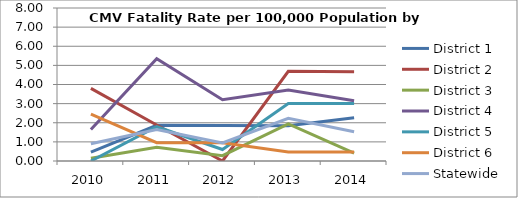
| Category | District 1 | District 2 | District 3 | District 4 | District 5 | District 6 | Statewide |
|---|---|---|---|---|---|---|---|
| 2010.0 | 0.465 | 3.795 | 0.146 | 1.645 | 0 | 2.445 | 0.898 |
| 2011.0 | 1.864 | 1.883 | 0.714 | 5.347 | 1.793 | 0.956 | 1.64 |
| 2012.0 | 1.856 | 0 | 0.282 | 3.206 | 0.6 | 0.955 | 0.94 |
| 2013.0 | 1.839 | 4.691 | 1.938 | 3.706 | 3.01 | 0.475 | 2.233 |
| 2014.0 | 2.258 | 4.671 | 0.407 | 3.15 | 3.008 | 0.471 | 1.53 |